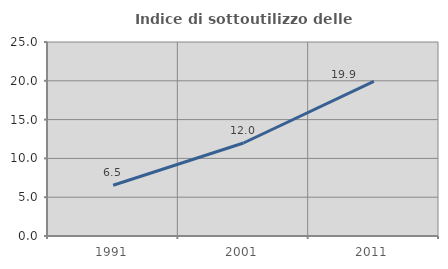
| Category | Indice di sottoutilizzo delle abitazioni  |
|---|---|
| 1991.0 | 6.534 |
| 2001.0 | 11.983 |
| 2011.0 | 19.913 |